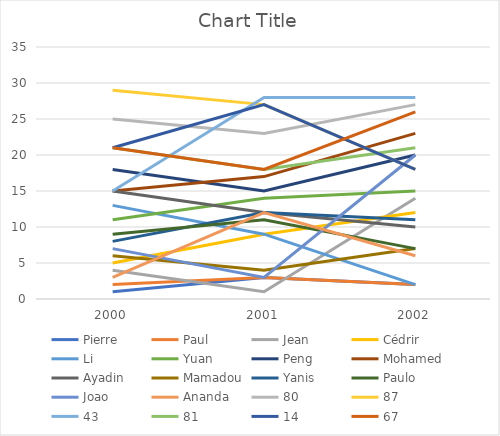
| Category | Pierre | Paul | Jean | Cédrir | Li | Yuan | Peng | Mohamed | Ayadin | Mamadou | Yanis | Paulo | Joao | Ananda | 80 | 87 | 43 | 81 | 14 | 67 |
|---|---|---|---|---|---|---|---|---|---|---|---|---|---|---|---|---|---|---|---|---|
| 2000 | 1 | 2 | 4 | 5 | 13 | 11 | 18 | 15 | 15 | 6 | 8 | 9 | 7 | 3 | 25 | 29 | 15 | 21 | 21 | 21 |
| 2001 | 3 | 3 | 1 | 9 | 9 | 14 | 15 | 17 | 12 | 4 | 12 | 11 | 3 | 12 | 23 | 27 | 28 | 18 | 27 | 18 |
| 2002 | 2 | 2 | 14 | 12 | 2 | 15 | 20 | 23 | 10 | 7 | 11 | 7 | 20 | 6 | 27 | 18 | 28 | 21 | 18 | 26 |